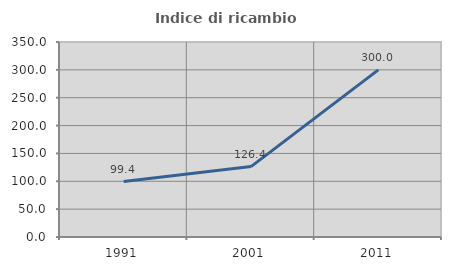
| Category | Indice di ricambio occupazionale  |
|---|---|
| 1991.0 | 99.422 |
| 2001.0 | 126.351 |
| 2011.0 | 300 |